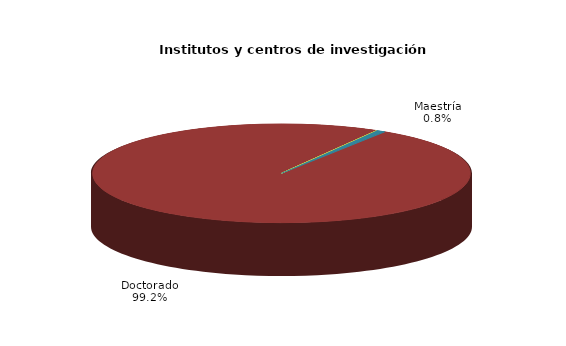
| Category | Series 0 |
|---|---|
| Licenciatura | 0 |
| Especialización | 0 |
| Maestría | 13 |
| Doctorado | 1689 |